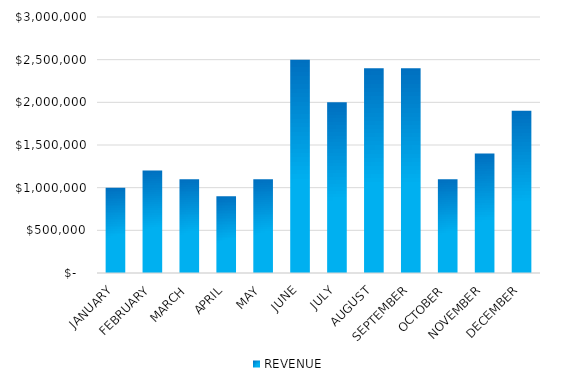
| Category | REVENUE |
|---|---|
| JANUARY | 1000000 |
| FEBRUARY | 1200000 |
| MARCH | 1100000 |
| APRIL | 900000 |
| MAY | 1100000 |
| JUNE | 2500000 |
| JULY | 2000000 |
| AUGUST | 2400000 |
| SEPTEMBER | 2400000 |
| OCTOBER | 1100000 |
| NOVEMBER | 1400000 |
| DECEMBER | 1900000 |